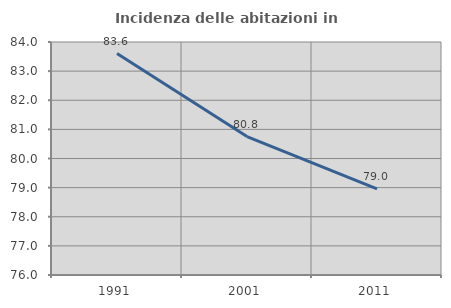
| Category | Incidenza delle abitazioni in proprietà  |
|---|---|
| 1991.0 | 83.604 |
| 2001.0 | 80.754 |
| 2011.0 | 78.957 |